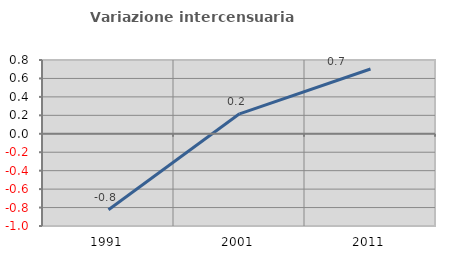
| Category | Variazione intercensuaria annua |
|---|---|
| 1991.0 | -0.824 |
| 2001.0 | 0.217 |
| 2011.0 | 0.703 |